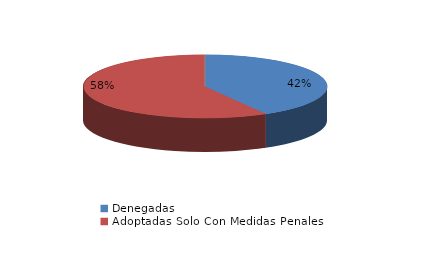
| Category | Series 0 |
|---|---|
| Denegadas | 503 |
| Adoptadas Solo Con Medidas Penales | 702 |
| Adoptadas Con Medidas Civiles Y Penales | 0 |
| Adoptadas Con Medidas Solo Civiles | 0 |